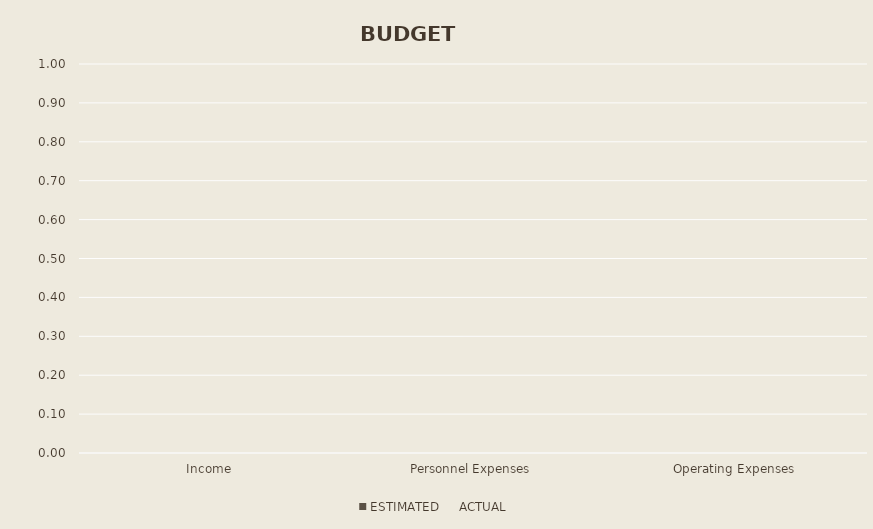
| Category | ESTIMATED | ACTUAL |
|---|---|---|
| Income | 0 | 0 |
| Personnel Expenses | 0 | 0 |
| Operating Expenses | 0 | 0 |